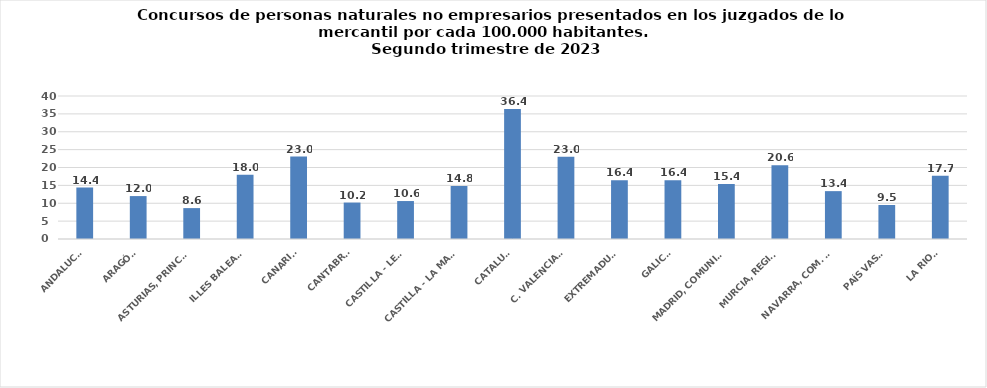
| Category | Series 0 |
|---|---|
| ANDALUCÍA | 14.385 |
| ARAGÓN | 12.006 |
| ASTURIAS, PRINCIPADO | 8.643 |
| ILLES BALEARS | 17.983 |
| CANARIAS | 23.047 |
| CANTABRIA | 10.195 |
| CASTILLA - LEÓN | 10.619 |
| CASTILLA - LA MANCHA | 14.803 |
| CATALUÑA | 36.397 |
| C. VALENCIANA | 22.996 |
| EXTREMADURA | 16.409 |
| GALICIA | 16.446 |
| MADRID, COMUNIDAD | 15.389 |
| MURCIA, REGIÓN | 20.609 |
| NAVARRA, COM. FORAL | 13.389 |
| PAÍS VASCO | 9.505 |
| LA RIOJA | 17.687 |